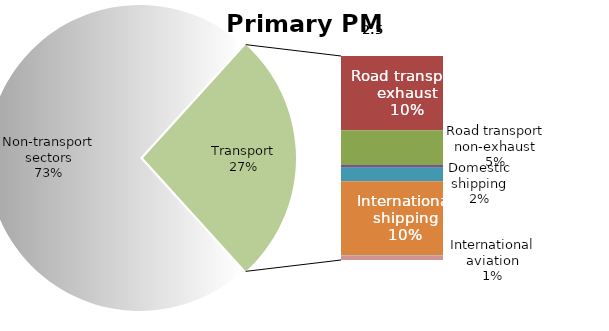
| Category | Series 0 |
|---|---|
| Non-transport sectors | 1135.951 |
| Road transport exhaust | 149.469 |
| Road transport non-exhaust | 70.328 |
| Railways | 5.602 |
| Domestic shipping | 27.101 |
| International shipping | 149.624 |
| Domestic aviation | 1.122 |
| International aviation | 7.928 |